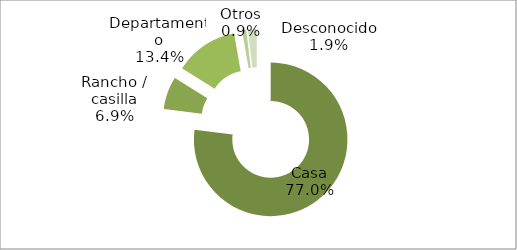
| Category | Series 0 |
|---|---|
| Casa | 77.004 |
| Rancho / casilla | 6.873 |
| Departamento | 13.374 |
| Otros | 0.868 |
| Desconocido | 1.88 |